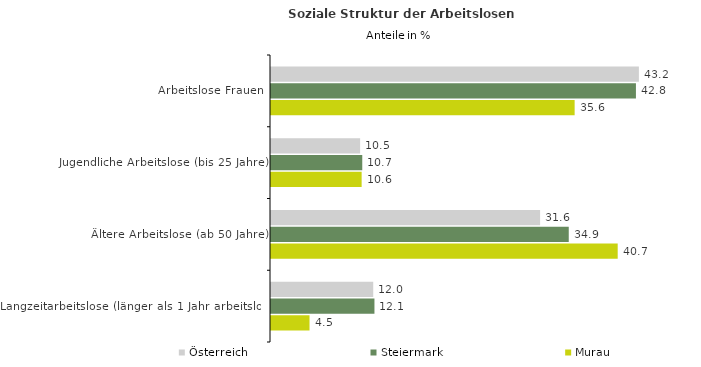
| Category | Österreich | Steiermark | Murau |
|---|---|---|---|
| Arbeitslose Frauen | 43.18 | 42.833 | 35.638 |
| Jugendliche Arbeitslose (bis 25 Jahre) | 10.46 | 10.711 | 10.638 |
| Ältere Arbeitslose (ab 50 Jahre) | 31.584 | 34.947 | 40.691 |
| Langzeitarbeitslose (länger als 1 Jahr arbeitslos) | 11.999 | 12.142 | 4.521 |